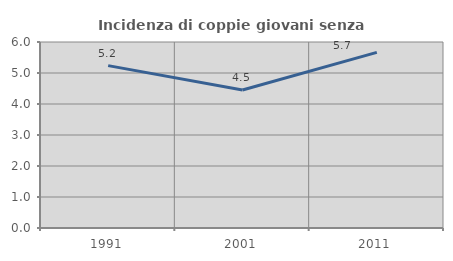
| Category | Incidenza di coppie giovani senza figli |
|---|---|
| 1991.0 | 5.238 |
| 2001.0 | 4.453 |
| 2011.0 | 5.667 |